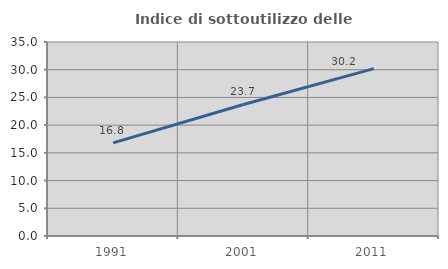
| Category | Indice di sottoutilizzo delle abitazioni  |
|---|---|
| 1991.0 | 16.797 |
| 2001.0 | 23.729 |
| 2011.0 | 30.199 |